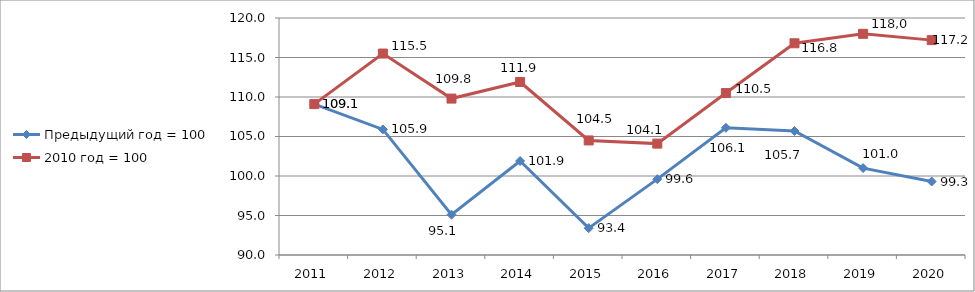
| Category | Предыдущий год = 100 | 2010 год = 100 |
|---|---|---|
| 0 | 109.1 |  |
| 1 | 105.9 |  |
| 2 | 95.1 |  |
| 3 | 101.9 |  |
| 4 | 93.4 |  |
| 5 | 99.6 |  |
| 6 | 106.1 |  |
| 7 | 105.7 |  |
| 8 | 101 |  |
| 9 | 99.3 |  |